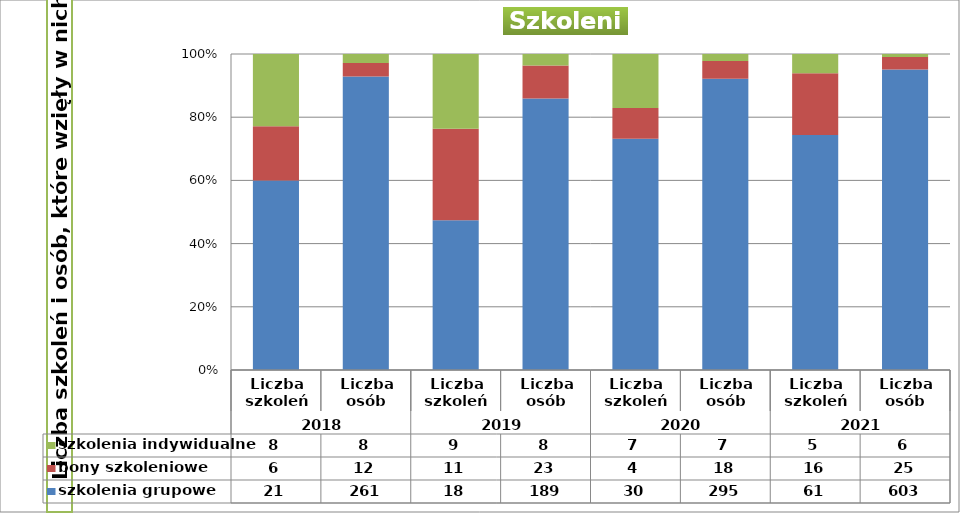
| Category | szkolenia grupowe | bony szkoleniowe | szkolenia indywidualne |
|---|---|---|---|
| 0 | 21 | 6 | 8 |
| 1 | 261 | 12 | 8 |
| 2 | 18 | 11 | 9 |
| 3 | 189 | 23 | 8 |
| 4 | 30 | 4 | 7 |
| 5 | 295 | 18 | 7 |
| 6 | 61 | 16 | 5 |
| 7 | 603 | 25 | 6 |